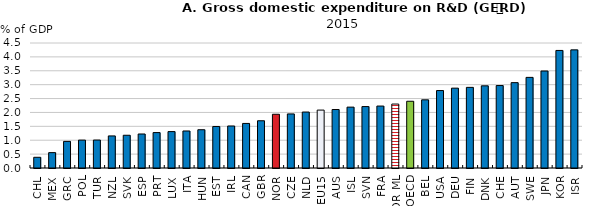
| Category | Series 0 |
|---|---|
| CHL | 0.386 |
| MEX | 0.553 |
| GRC | 0.958 |
| POL | 1.004 |
| TUR | 1.007 |
| NZL | 1.155 |
| SVK | 1.178 |
| ESP | 1.225 |
| PRT | 1.275 |
| LUX | 1.31 |
| ITA | 1.333 |
| HUN | 1.378 |
| EST | 1.495 |
| IRL | 1.512 |
| CAN | 1.605 |
| GBR | 1.701 |
| NOR | 1.935 |
| CZE | 1.947 |
| NLD | 2.015 |
| EU15 | 2.085 |
| AUS | 2.105 |
| ISL | 2.191 |
| SVN | 2.212 |
| FRA | 2.23 |
| NOR ML | 2.302 |
| OECD | 2.403 |
| BEL | 2.455 |
| USA | 2.788 |
| DEU | 2.875 |
| FIN | 2.903 |
| DNK | 2.959 |
| CHE | 2.968 |
| AUT | 3.073 |
| SWE | 3.262 |
| JPN | 3.492 |
| KOR | 4.232 |
| ISR | 4.253 |